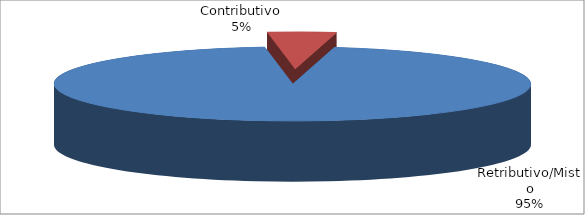
| Category | Decorrenti gennaio - settembre 2019 |
|---|---|
| Retributivo/Misto | 53334 |
| Contributivo | 2596 |